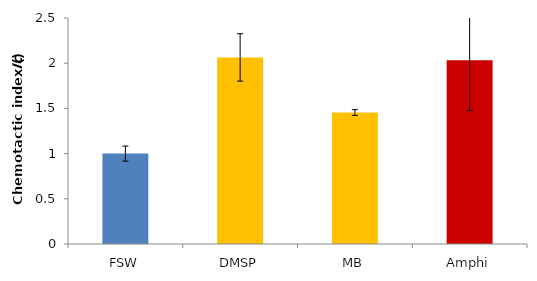
| Category | Series 0 |
|---|---|
| FSW | 1 |
| DMSP | 2.064 |
| MB | 1.454 |
| Amphi | 2.033 |